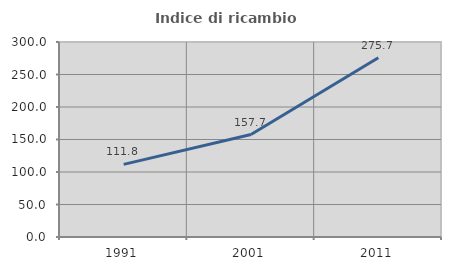
| Category | Indice di ricambio occupazionale  |
|---|---|
| 1991.0 | 111.777 |
| 2001.0 | 157.67 |
| 2011.0 | 275.676 |